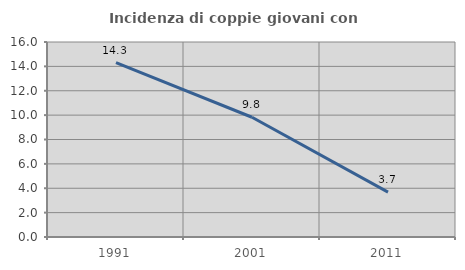
| Category | Incidenza di coppie giovani con figli |
|---|---|
| 1991.0 | 14.303 |
| 2001.0 | 9.825 |
| 2011.0 | 3.68 |